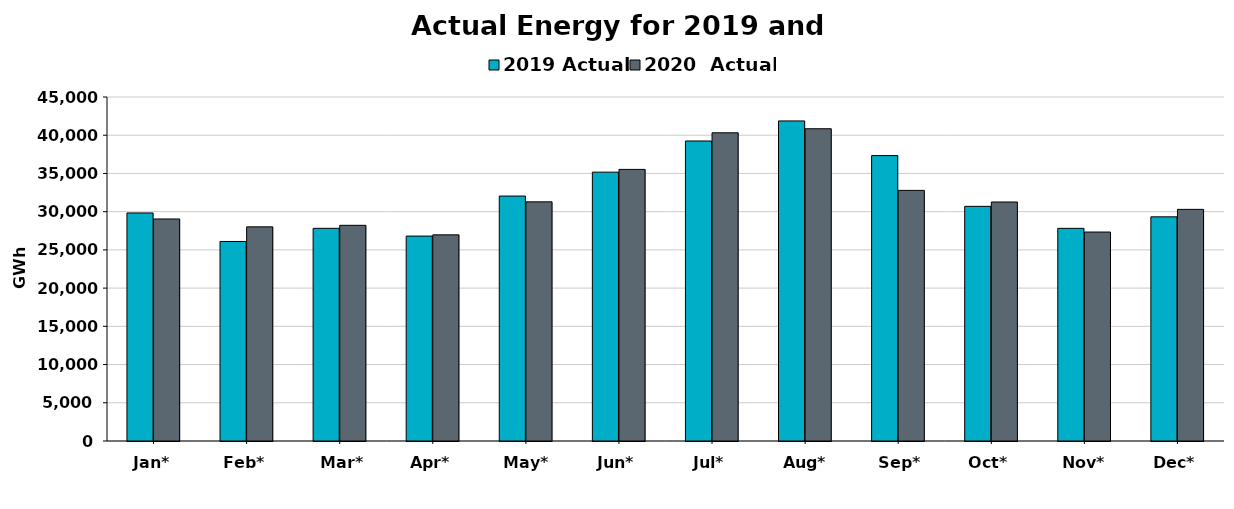
| Category | 2019 Actual | 2020  Actual |
|---|---|---|
| Jan* | 29830 | 29045 |
| Feb* | 26100 | 28014 |
| Mar* | 27821 | 28214 |
| Apr* | 26805 | 26968 |
| May* | 32042 | 31283 |
| Jun* | 35170 | 35530 |
| Jul* | 39246 | 40318 |
| Aug* | 41870 | 40847 |
| Sep* | 37338 | 32785 |
| Oct* | 30695 | 31266 |
| Nov* | 27818 | 27335 |
| Dec* | 29323 | 30301 |